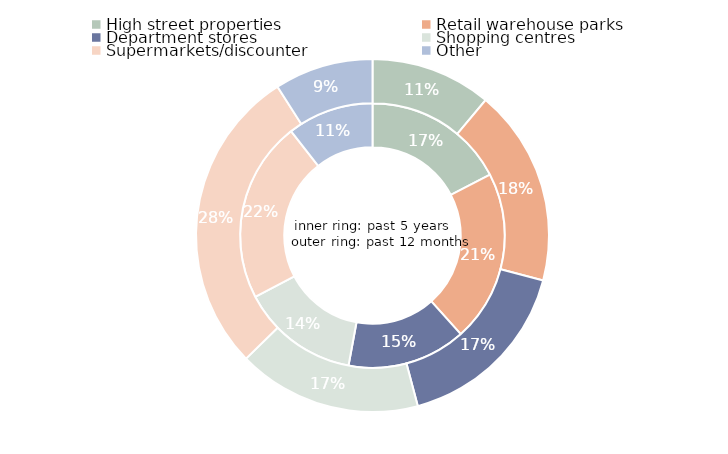
| Category | Series 1 | Series 0 |
|---|---|---|
| High street properties | 1757924226.678 | 765605300 |
| Retail warehouse parks | 2123795405.176 | 1246357299 |
| Department stores | 1467467919.152 | 1159499997.99 |
| Shopping centres | 1459255629.652 | 1164629084 |
| Supermarkets/discounter | 2235955540.628 | 1952509083.3 |
| Other | 1066925490.262 | 625211997 |